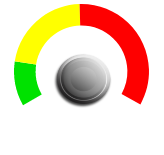
| Category | PIE |
|---|---|
| 0 | 2 |
| 1 | 0.12 |
| 2 | 6.88 |